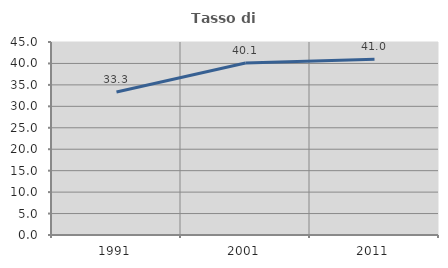
| Category | Tasso di occupazione   |
|---|---|
| 1991.0 | 33.333 |
| 2001.0 | 40.119 |
| 2011.0 | 40.963 |